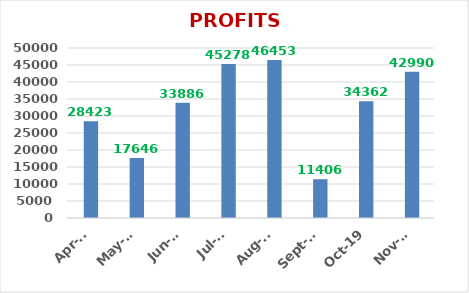
| Category | PROFITS (Rs.) |
|---|---|
| 2019-11-01 | 42990 |
| 2019-10-01 | 34362 |
| 2019-09-01 | 11406 |
| 2019-08-01 | 46453 |
| 2019-07-01 | 45278 |
| 2019-06-01 | 33886 |
| 2019-05-01 | 17646 |
| 2019-04-01 | 28423 |